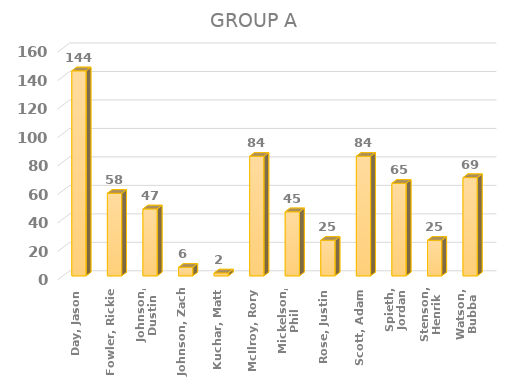
| Category | Series 0 |
|---|---|
| Day, Jason | 144 |
| Fowler, Rickie | 58 |
| Johnson, Dustin | 47 |
| Johnson, Zach | 6 |
| Kuchar, Matt | 2 |
| McIlroy, Rory | 84 |
| Mickelson, Phil | 45 |
| Rose, Justin | 25 |
| Scott, Adam | 84 |
| Spieth, Jordan | 65 |
| Stenson, Henrik | 25 |
| Watson, Bubba | 69 |